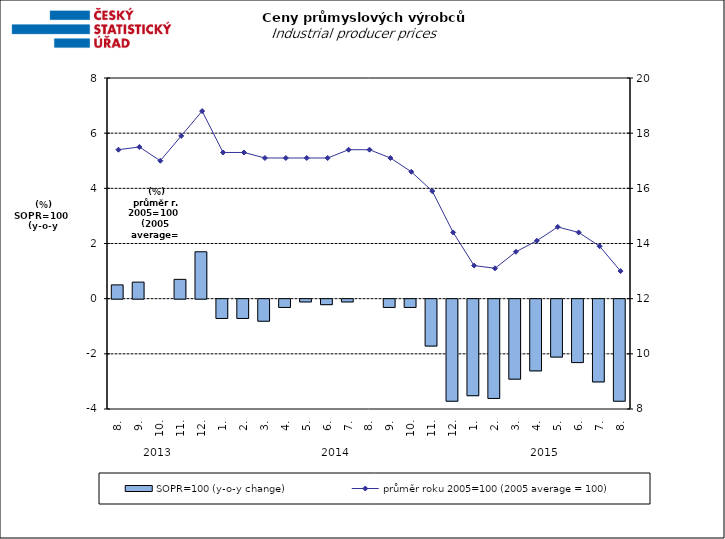
| Category | SOPR=100 (y-o-y change)   |
|---|---|
| 0 | 0.5 |
| 1 | 0.6 |
| 2 | 0 |
| 3 | 0.7 |
| 4 | 1.7 |
| 5 | -0.7 |
| 6 | -0.7 |
| 7 | -0.8 |
| 8 | -0.3 |
| 9 | -0.1 |
| 10 | -0.2 |
| 11 | -0.1 |
| 12 | 0 |
| 13 | -0.3 |
| 14 | -0.3 |
| 15 | -1.7 |
| 16 | -3.7 |
| 17 | -3.5 |
| 18 | -3.6 |
| 19 | -2.9 |
| 20 | -2.6 |
| 21 | -2.1 |
| 22 | -2.3 |
| 23 | -3 |
| 24 | -3.7 |